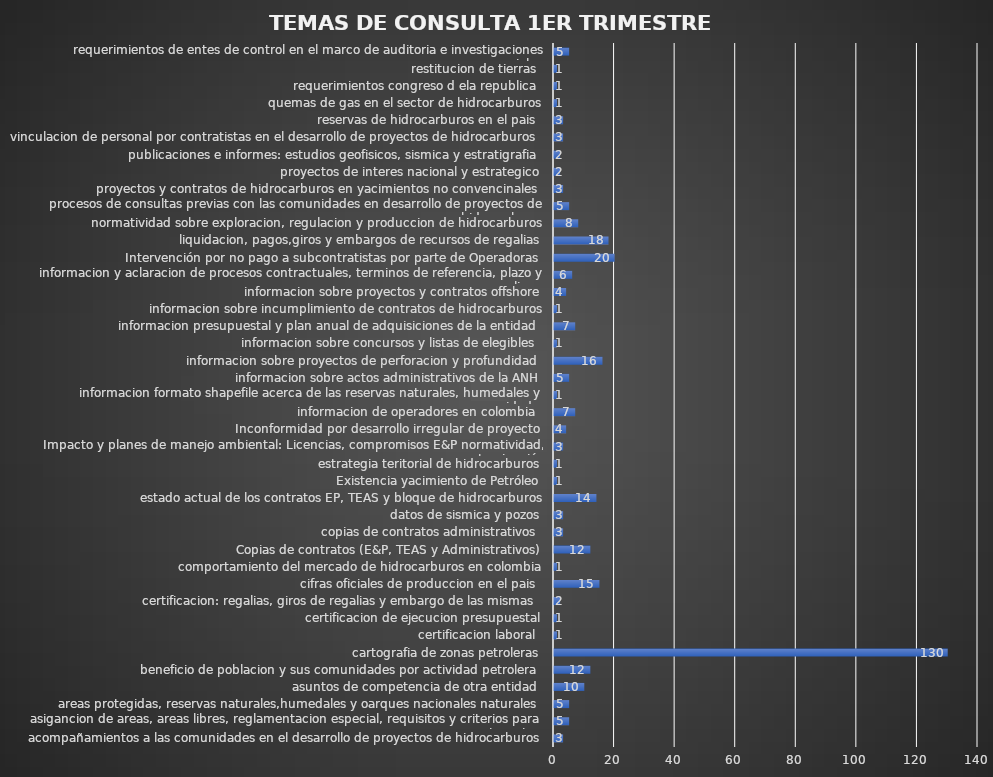
| Category | Series 0 |
|---|---|
| acompañamientos a las comunidades en el desarrollo de proyectos de hidrocarburos | 3 |
| asigancion de areas, areas libres, reglamentacion especial, requisitos y criterios para asignacion  | 5 |
| areas protegidas, reservas naturales,humedales y oarques nacionales naturales | 5 |
| asuntos de competencia de otra entidad  | 10 |
| beneficio de poblacion y sus comunidades por actividad petrolera  | 12 |
| cartografia de zonas petroleras | 130 |
| certificacion laboral  | 1 |
| certificacion de ejecucion presupuestal | 1 |
| certificacion: regalias, giros de regalias y embargo de las mismas  | 2 |
| cifras oficiales de produccion en el pais  | 15 |
| comportamiento del mercado de hidrocarburos en colombia | 1 |
| Copias de contratos (E&P, TEAS y Administrativos) | 12 |
| copias de contratos administrativos  | 3 |
| datos de sismica y pozos | 3 |
| estado actual de los contratos EP, TEAS y bloque de hidrocarburos | 14 |
| Existencia yacimiento de Petróleo | 1 |
| estrategia teritorial de hidrocarburos | 1 |
| Impacto y planes de manejo ambiental: Licencias, compromisos E&P normatividad, contaminación | 3 |
| Inconformidad por desarrollo irregular de proyecto | 4 |
| informacion de operadores en colombia  | 7 |
| informacion formato shapefile acerca de las reservas naturales, humedales y comunidades | 1 |
| informacion sobre actos administrativos de la ANH | 5 |
| informacion sobre proyectos de perforacion y profundidad  | 16 |
| informacion sobre concursos y listas de elegibles  | 1 |
| informacion presupuestal y plan anual de adquisiciones de la entidad  | 7 |
| informacion sobre incumplimiento de contratos de hidrocarburos | 1 |
| informacion sobre proyectos y contratos offshore | 4 |
| informacion y aclaracion de procesos contractuales, terminos de referencia, plazo y polizas  | 6 |
| Intervención por no pago a subcontratistas por parte de Operadoras  | 20 |
| liquidacion, pagos,giros y embargos de recursos de regalias | 18 |
| normatividad sobre exploracion, regulacion y produccion de hidrocarburos | 8 |
| procesos de consultas previas con las comunidades en desarrollo de proyectos de hidrocarburos | 5 |
| proyectos y contratos de hidrocarburos en yacimientos no convencinales  | 3 |
| proyectos de interes nacional y estrategico | 2 |
| publicaciones e informes: estudios geofisicos, sismica y estratigrafia | 2 |
| vinculacion de personal por contratistas en el desarrollo de proyectos de hidrocarburos  | 3 |
| reservas de hidrocarburos en el pais  | 3 |
| quemas de gas en el sector de hidrocarburos | 1 |
| requerimientos congreso d ela republica  | 1 |
| restitucion de tierras  | 1 |
| requerimientos de entes de control en el marco de auditoria e investigaciones especiales | 5 |